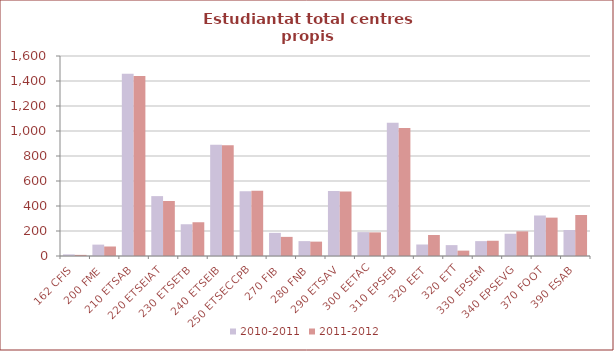
| Category | 2010-2011 | 2011-2012 |
|---|---|---|
| 162 CFIS | 13 | 9 |
| 200 FME | 91 | 76 |
| 210 ETSAB | 1459 | 1440 |
| 220 ETSEIAT | 479 | 440 |
| 230 ETSETB | 254 | 270 |
| 240 ETSEIB | 890 | 886 |
| 250 ETSECCPB | 519 | 523 |
| 270 FIB | 185 | 153 |
| 280 FNB | 119 | 115 |
| 290 ETSAV | 521 | 517 |
| 300 EETAC | 191 | 189 |
| 310 EPSEB | 1066 | 1024 |
| 320 EET | 92 | 168 |
| 320 ETT | 87 | 43 |
| 330 EPSEM | 119 | 122 |
| 340 EPSEVG | 178 | 197 |
| 370 FOOT | 324 | 307 |
| 390 ESAB | 208 | 328 |